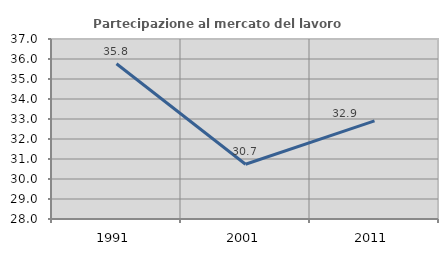
| Category | Partecipazione al mercato del lavoro  femminile |
|---|---|
| 1991.0 | 35.765 |
| 2001.0 | 30.74 |
| 2011.0 | 32.908 |